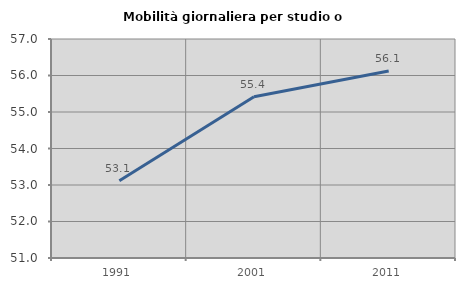
| Category | Mobilità giornaliera per studio o lavoro |
|---|---|
| 1991.0 | 53.117 |
| 2001.0 | 55.42 |
| 2011.0 | 56.122 |